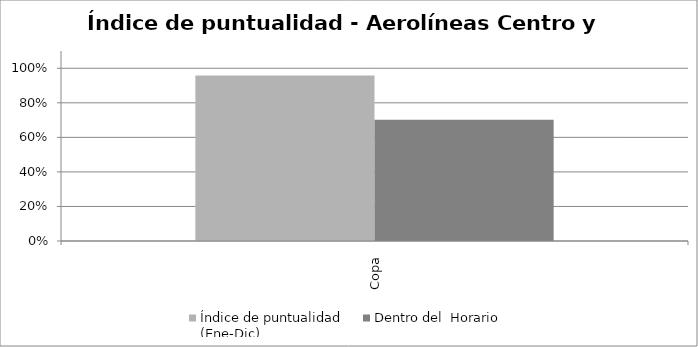
| Category | Índice de puntualidad
(Ene-Dic) | Dentro del  Horario |
|---|---|---|
| Copa | 0.959 | 0.702 |